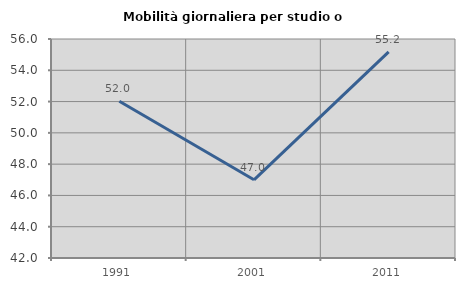
| Category | Mobilità giornaliera per studio o lavoro |
|---|---|
| 1991.0 | 52.017 |
| 2001.0 | 46.999 |
| 2011.0 | 55.178 |